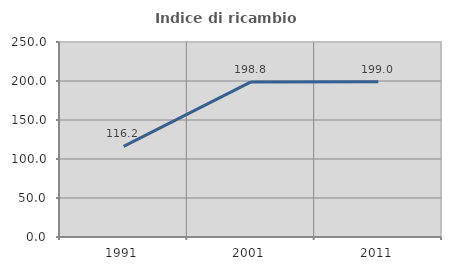
| Category | Indice di ricambio occupazionale  |
|---|---|
| 1991.0 | 116.213 |
| 2001.0 | 198.806 |
| 2011.0 | 199.036 |